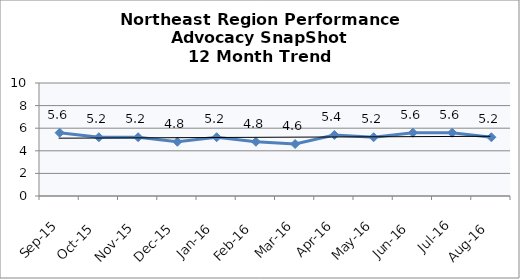
| Category | Northeast Region |
|---|---|
| Sep-15 | 5.6 |
| Oct-15 | 5.2 |
| Nov-15 | 5.2 |
| Dec-15 | 4.8 |
| Jan-16 | 5.2 |
| Feb-16 | 4.8 |
| Mar-16 | 4.6 |
| Apr-16 | 5.4 |
| May-16 | 5.2 |
| Jun-16 | 5.6 |
| Jul-16 | 5.6 |
| Aug-16 | 5.2 |